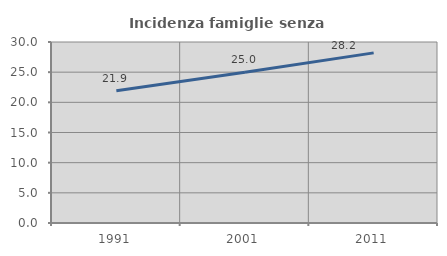
| Category | Incidenza famiglie senza nuclei |
|---|---|
| 1991.0 | 21.915 |
| 2001.0 | 24.988 |
| 2011.0 | 28.195 |